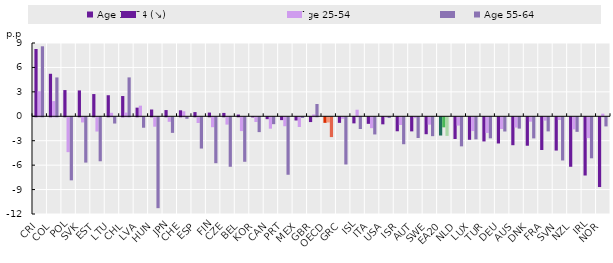
| Category | Age 15-24 (↘) | Age 25-54 | Age 55-64 |
|---|---|---|---|
| CRI | 8.267 | 3.082 | 8.595 |
| COL | 5.221 | 1.867 | 4.772 |
| POL | 3.22 | -4.283 | -7.742 |
| SVK | 3.178 | -0.633 | -5.564 |
| EST | 2.73 | -1.752 | -5.401 |
| LTU | 2.586 | 0.428 | -0.767 |
| CHL | 2.487 | 0.454 | 4.777 |
| LVA | 1.061 | 1.306 | -1.283 |
| HUN | 0.832 | -1.157 | -11.161 |
| JPN | 0.765 | -0.556 | -1.914 |
| CHE | 0.735 | 0.616 | -0.183 |
| ESP | 0.515 | -0.704 | -3.839 |
| FIN | 0.455 | -1.218 | -5.638 |
| CZE | 0.412 | -0.9 | -6.079 |
| BEL | 0.211 | -1.695 | -5.463 |
| KOR | -0.015 | -0.58 | -1.822 |
| CAN | -0.231 | -1.399 | -0.846 |
| PRT | -0.349 | -1.099 | -7.057 |
| MEX | -0.391 | -1.192 | -0.08 |
| GBR | -0.587 | 0.223 | 1.511 |
| OECD | -0.683 | -0.638 | -2.431 |
| GRC | -0.684 | -0.19 | -5.794 |
| ISL | -0.747 | 0.805 | -1.439 |
| ITA | -0.805 | -1.336 | -2.107 |
| USA | -0.865 | -0.033 | -0.093 |
| ISR | -1.718 | -0.944 | -3.308 |
| AUT | -1.73 | -0.102 | -2.541 |
| SWE | -2.079 | -0.908 | -2.318 |
| EA20 | -2.24 | -1.236 | -2.285 |
| NLD | -2.665 | -1.019 | -3.57 |
| LUX | -2.764 | -1.693 | -2.71 |
| TUR | -2.967 | -1.922 | -2.585 |
| DEU | -3.216 | -1.442 | -1.746 |
| AUS | -3.429 | -1.26 | -1.391 |
| DNK | -3.493 | -0.539 | -2.592 |
| FRA | -4.02 | -0.412 | -1.734 |
| SVN | -4.087 | -0.335 | -5.304 |
| NZL | -6.078 | -1.486 | -1.788 |
| IRL | -7.15 | -2.559 | -5.037 |
| NOR | -8.567 | 0.323 | -1.121 |